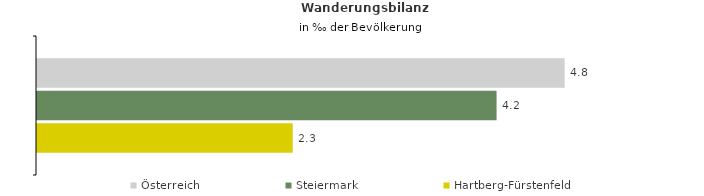
| Category | Österreich | Steiermark | Hartberg-Fürstenfeld |
|---|---|---|---|
| Wanderungsrate in ‰ der Bevölkerung, Periode 2017-2021 | 4.789 | 4.172 | 2.321 |